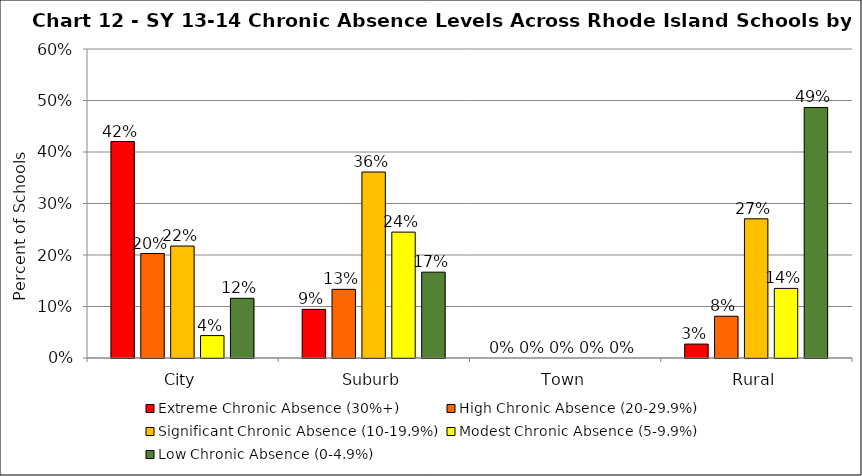
| Category | Extreme Chronic Absence (30%+) | High Chronic Absence (20-29.9%) | Significant Chronic Absence (10-19.9%) | Modest Chronic Absence (5-9.9%) | Low Chronic Absence (0-4.9%) |
|---|---|---|---|---|---|
| 0 | 0.42 | 0.203 | 0.217 | 0.043 | 0.116 |
| 1 | 0.094 | 0.133 | 0.361 | 0.244 | 0.167 |
| 2 | 0 | 0 | 0 | 0 | 0 |
| 3 | 0.027 | 0.081 | 0.27 | 0.135 | 0.486 |